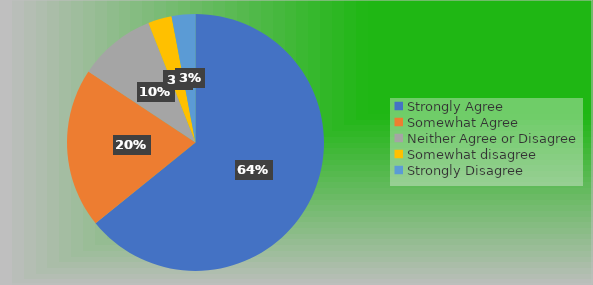
| Category | Series 0 |
|---|---|
| Strongly Agree | 86 |
| Somewhat Agree | 27 |
| Neither Agree or Disagree | 13 |
| Somewhat disagree | 4 |
| Strongly Disagree | 4 |